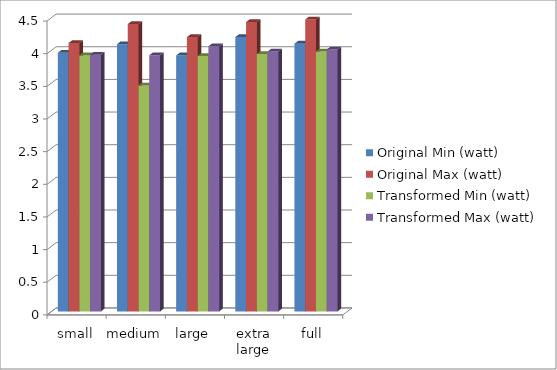
| Category | Original Min (watt) | Original Max (watt) | Transformed Min (watt) | Transformed Max (watt) |
|---|---|---|---|---|
| small | 3.96 | 4.11 | 3.92 | 3.93 |
| medium | 4.092 | 4.4 | 3.46 | 3.922 |
| large | 3.92 | 4.2 | 3.91 | 4.06 |
| extra large | 4.2 | 4.43 | 3.94 | 3.979 |
| full | 4.1 | 4.47 | 3.98 | 4.01 |